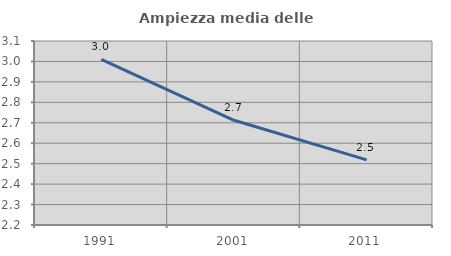
| Category | Ampiezza media delle famiglie |
|---|---|
| 1991.0 | 3.011 |
| 2001.0 | 2.712 |
| 2011.0 | 2.519 |